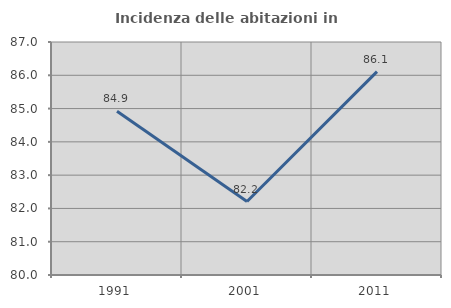
| Category | Incidenza delle abitazioni in proprietà  |
|---|---|
| 1991.0 | 84.921 |
| 2001.0 | 82.206 |
| 2011.0 | 86.111 |